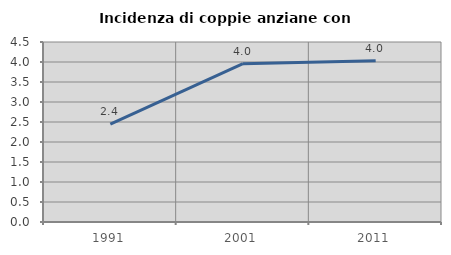
| Category | Incidenza di coppie anziane con figli |
|---|---|
| 1991.0 | 2.448 |
| 2001.0 | 3.957 |
| 2011.0 | 4.029 |